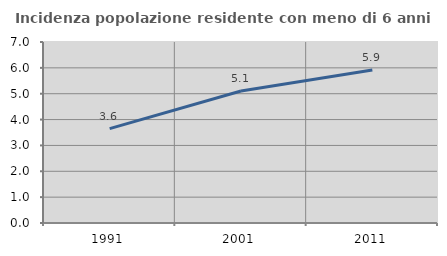
| Category | Incidenza popolazione residente con meno di 6 anni |
|---|---|
| 1991.0 | 3.649 |
| 2001.0 | 5.103 |
| 2011.0 | 5.915 |